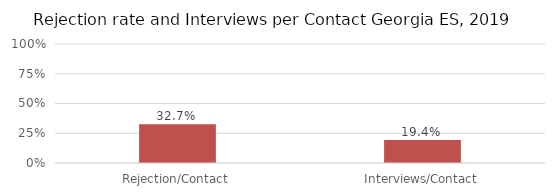
| Category | Series 0 |
|---|---|
| Rejection/Contact | 0.327 |
| Interviews/Contact | 0.194 |